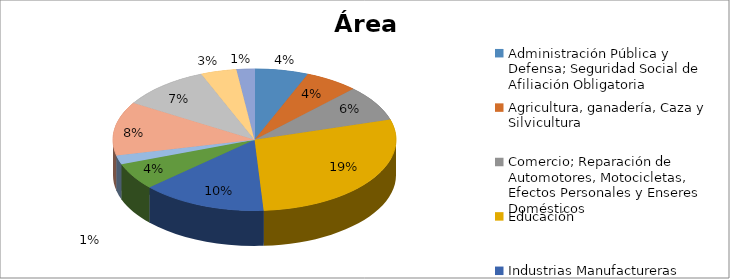
| Category | Series 0 |
|---|---|
| Administración Pública y Defensa; Seguridad Social de Afiliación Obligatoria | 0.042 |
| Agricultura, ganadería, Caza y Silvicultura | 0.042 |
| Comercio; Reparación de Automotores, Motocicletas, Efectos Personales y Enseres Domésticos | 0.056 |
| Educación | 0.194 |
| Industrias Manufactureras | 0.097 |
| Intermediación Financiera | 0.042 |
| Organizaciones y Órganos Extraterritoriales | 0.014 |
| Otras Actividades de Servicios Comunitarios, Sociales y Personales | 0.083 |
| Servicios Sociales y de Salud | 0.069 |
| Suministros de Electricidad, Gas y Agua | 0.028 |
| Transporte, Almacenamiento y Comunicaciones | 0.014 |